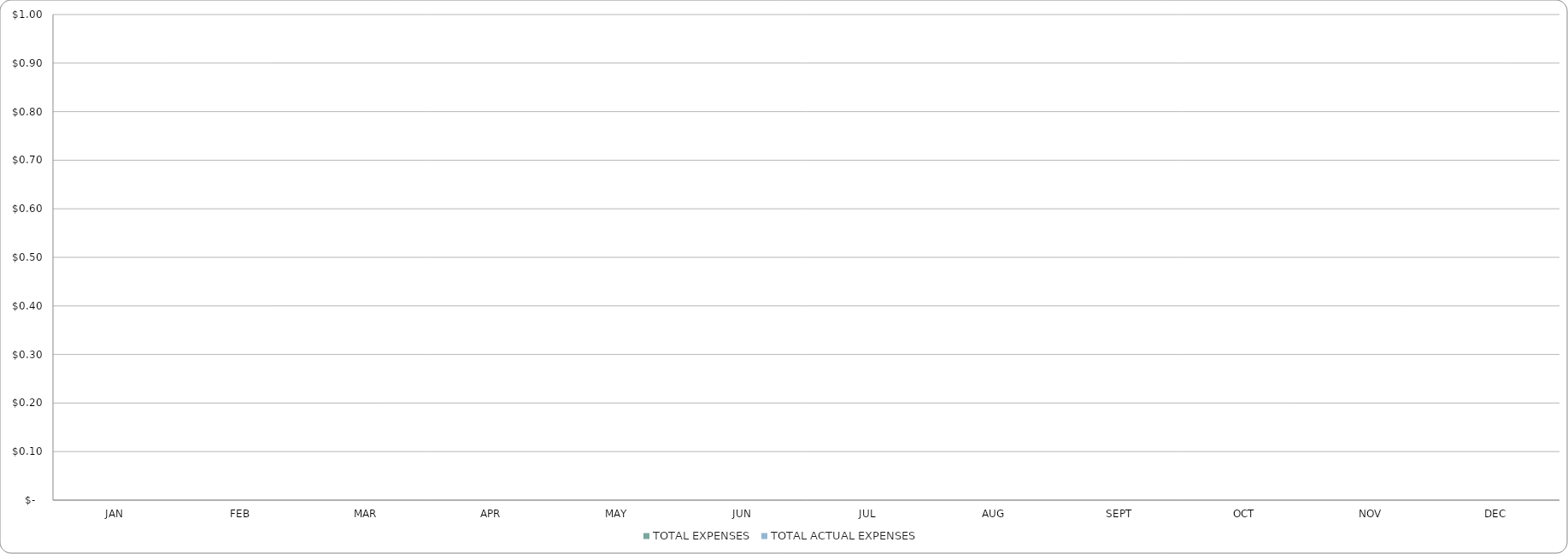
| Category | TOTAL EXPENSES | TOTAL ACTUAL EXPENSES |
|---|---|---|
| JAN | 0 | 0 |
| FEB | 0 | 0 |
| MAR | 0 | 0 |
| APR | 0 | 0 |
| MAY | 0 | 0 |
| JUN | 0 | 0 |
| JUL | 0 | 0 |
| AUG | 0 | 0 |
| SEPT | 0 | 0 |
| OCT | 0 | 0 |
| NOV | 0 | 0 |
| DEC | 0 | 0 |